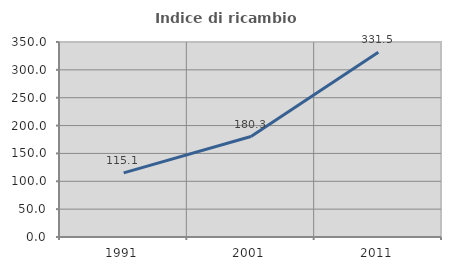
| Category | Indice di ricambio occupazionale  |
|---|---|
| 1991.0 | 115.11 |
| 2001.0 | 180.323 |
| 2011.0 | 331.507 |